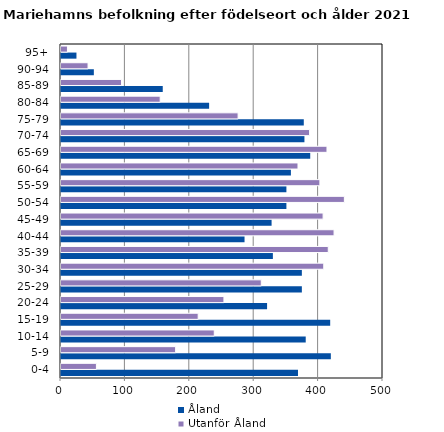
| Category | Åland | Utanför Åland |
|---|---|---|
| 0-4 | 368 | 55 |
| 5-9 | 419 | 178 |
| 10-14 | 380 | 238 |
| 15-19 | 418 | 213 |
| 20-24 | 320 | 253 |
| 25-29 | 374 | 311 |
| 30-34 | 374 | 408 |
| 35-39 | 329 | 415 |
| 40-44 | 285 | 424 |
| 45-49 | 327 | 407 |
| 50-54 | 350 | 440 |
| 55-59 | 350 | 402 |
| 60-64 | 357 | 368 |
| 65-69 | 387 | 413 |
| 70-74 | 378 | 386 |
| 75-79 | 377 | 275 |
| 80-84 | 230 | 154 |
| 85-89 | 158 | 94 |
| 90-94 | 51 | 42 |
| 95+ | 24 | 10 |